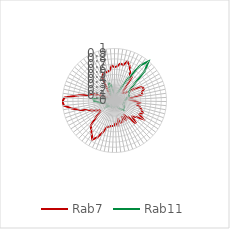
| Category | Rab7 | Rab11 |
|---|---|---|
| 0.0 | 0.641 | 0.118 |
| 0.10913 | 0.661 | 0.079 |
| 0.21825 | 0.72 | 0.076 |
| 0.32738 | 0.702 | 0.093 |
| 0.43651 | 0.79 | 0.119 |
| 0.54563 | 0.738 | 0.173 |
| 0.65476 | 0.652 | 0.273 |
| 0.76389 | 0.56 | 0.504 |
| 0.87302 | 0.558 | 0.844 |
| 0.98214 | 0.303 | 1 |
| 1.09127 | 0.21 | 0.818 |
| 1.2004 | 0.201 | 0.504 |
| 1.30952 | 0.241 | 0.364 |
| 1.41865 | 0.442 | 0.319 |
| 1.52778 | 0.587 | 0.326 |
| 1.6369 | 0.611 | 0.303 |
| 1.74603 | 0.549 | 0.293 |
| 1.85516 | 0.547 | 0.242 |
| 1.96429 | 0.294 | 0.238 |
| 2.07341 | 0.286 | 0.211 |
| 2.18254 | 0.389 | 0.212 |
| 2.29167 | 0.485 | 0.19 |
| 2.40079 | 0.436 | 0.178 |
| 2.50992 | 0.51 | 0.184 |
| 2.61905 | 0.55 | 0.185 |
| 2.72817 | 0.598 | 0.181 |
| 2.8373 | 0.54 | 0.209 |
| 2.94643 | 0.657 | 0.216 |
| 3.05556 | 0.521 | 0.228 |
| 3.16468 | 0.461 | 0.242 |
| 3.27381 | 0.598 | 0.257 |
| 3.38294 | 0.416 | 0.231 |
| 3.49206 | 0.343 | 0.2 |
| 3.60119 | 0.425 | 0.164 |
| 3.71032 | 0.356 | 0.147 |
| 3.81944 | 0.44 | 0.126 |
| 3.92857 | 0.445 | 0.103 |
| 4.0377 | 0.375 | 0.104 |
| 4.14683 | 0.474 | 0.08 |
| 4.25595 | 0.441 | 0.086 |
| 4.36508 | 0.49 | 0.128 |
| 4.47421 | 0.491 | 0.118 |
| 4.58333 | 0.515 | 0.139 |
| 4.69246 | 0.535 | 0.129 |
| 4.80159 | 0.66 | 0.135 |
| 4.91071 | 0.782 | 0.129 |
| 5.01984 | 0.867 | 0.134 |
| 5.12897 | 0.778 | 0.111 |
| 5.2381 | 0.717 | 0.142 |
| 5.34722 | 0.667 | 0.151 |
| 5.45635 | 0.483 | 0.16 |
| 5.56548 | 0.345 | 0.203 |
| 5.6746 | 0.339 | 0.167 |
| 5.78373 | 0.402 | 0.142 |
| 5.89286 | 0.475 | 0.14 |
| 6.00198 | 0.552 | 0.149 |
| 6.11111 | 0.711 | 0.194 |
| 6.22024 | 0.846 | 0.265 |
| 6.32937 | 0.979 | 0.32 |
| 6.43849 | 1 | 0.392 |
| 6.54762 | 0.962 | 0.407 |
| 6.65675 | 0.707 | 0.294 |
| 6.76587 | 0.5 | 0.133 |
| 6.875 | 0.41 | 0.039 |
| 6.98413 | 0.256 | 0.005 |
| 7.09325 | 0.087 | 0.009 |
| 7.20238 | 0 | 0 |
| 7.31151 | 0.061 | 0.01 |
| 7.42063 | 0.084 | 0.021 |
| 7.52976 | 0.049 | 0.03 |
| 7.63889 | 0.092 | 0.032 |
| 7.74802 | 0.196 | 0.065 |
| 7.85714 | 0.287 | 0.096 |
| 7.96627 | 0.518 | 0.181 |
| 8.0754 | 0.56 | 0.265 |
| 8.18452 | 0.563 | 0.347 |
| 8.29365 | 0.568 | 0.32 |
| 8.40278 | 0.582 | 0.218 |
| 8.5119 | 0.673 | 0.148 |